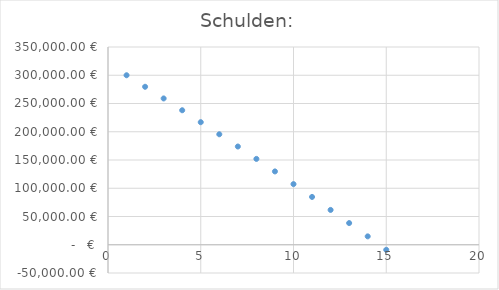
| Category | Schulden: |
|---|---|
| 1.0 | 300000 |
| 2.0 | 279600 |
| 3.0 | 258955.2 |
| 4.0 | 238062.662 |
| 5.0 | 216919.414 |
| 6.0 | 195522.447 |
| 7.0 | 173868.717 |
| 8.0 | 151955.141 |
| 9.0 | 129778.603 |
| 10.0 | 107335.946 |
| 11.0 | 84623.978 |
| 12.0 | 61639.465 |
| 13.0 | 38379.139 |
| 14.0 | 14839.689 |
| 15.0 | -8982.235 |